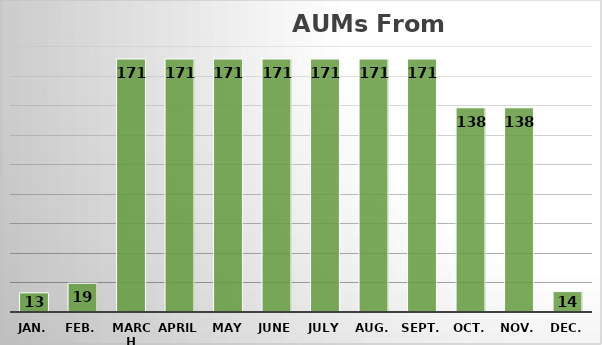
| Category | #REF! | 13 |
|---|---|---|
| Jan. | 12.97 |  |
| Feb. | 19.455 |  |
| March | 171.2 |  |
| April | 171.2 |  |
| May | 171.2 |  |
| June | 171.2 |  |
| July | 171.2 |  |
| Aug. | 171.2 |  |
| Sept. | 171.2 |  |
| Oct. | 138.2 |  |
| Nov. | 138.2 |  |
| Dec. | 13.82 |  |